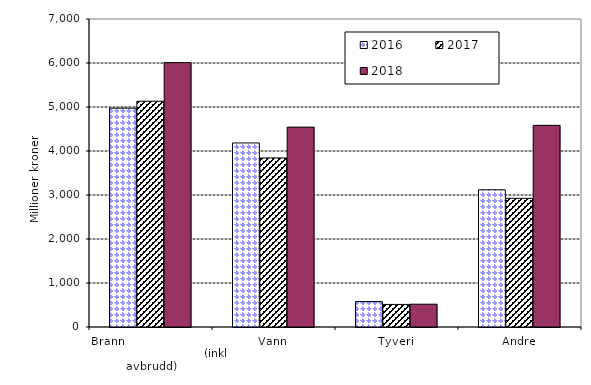
| Category | 2016 | 2017 | 2018 |
|---|---|---|---|
| Brann                                                       (inkl avbrudd) | 4973.264 | 5130.97 | 6008.498 |
| Vann | 4183.152 | 3842.246 | 4542.614 |
| Tyveri | 578.224 | 513.098 | 518.421 |
| Andre | 3118.369 | 2924.613 | 4583.393 |